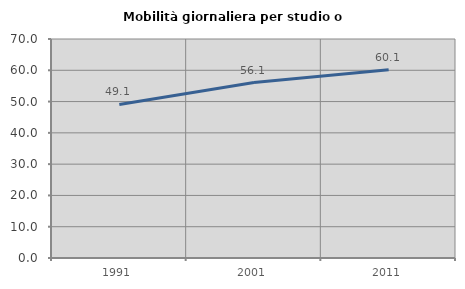
| Category | Mobilità giornaliera per studio o lavoro |
|---|---|
| 1991.0 | 49.088 |
| 2001.0 | 56.069 |
| 2011.0 | 60.136 |